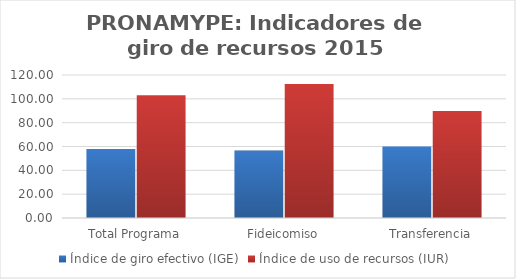
| Category | Índice de giro efectivo (IGE) | Índice de uso de recursos (IUR)  |
|---|---|---|
| Total Programa | 57.984 | 102.96 |
| Fideicomiso | 56.618 | 112.42 |
| Transferencia | 60 | 89.794 |